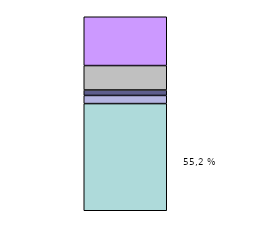
| Category | Series 0 | Series 1 | Series 2 | Series 3 | Series 4 |
|---|---|---|---|---|---|
| 0 | 175154 | 13294 | 8929 | 39933 | 79772 |